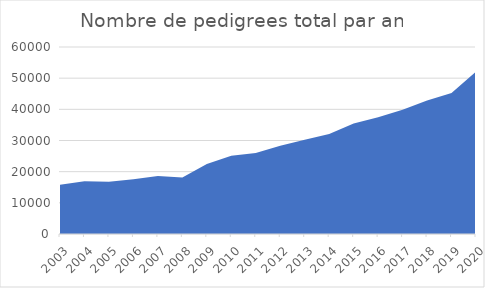
| Category | Series 0 |
|---|---|
| 2003.0 | 15833 |
| 2004.0 | 16927 |
| 2005.0 | 16765 |
| 2006.0 | 17581 |
| 2007.0 | 18648 |
| 2008.0 | 18116 |
| 2009.0 | 22426 |
| 2010.0 | 25090 |
| 2011.0 | 26013 |
| 2012.0 | 28347 |
| 2013.0 | 30257 |
| 2014.0 | 32102 |
| 2015.0 | 35448 |
| 2016.0 | 37465 |
| 2017.0 | 39895 |
| 2018.0 | 42804 |
| 2019.0 | 45255 |
| 2020.0 | 52059 |